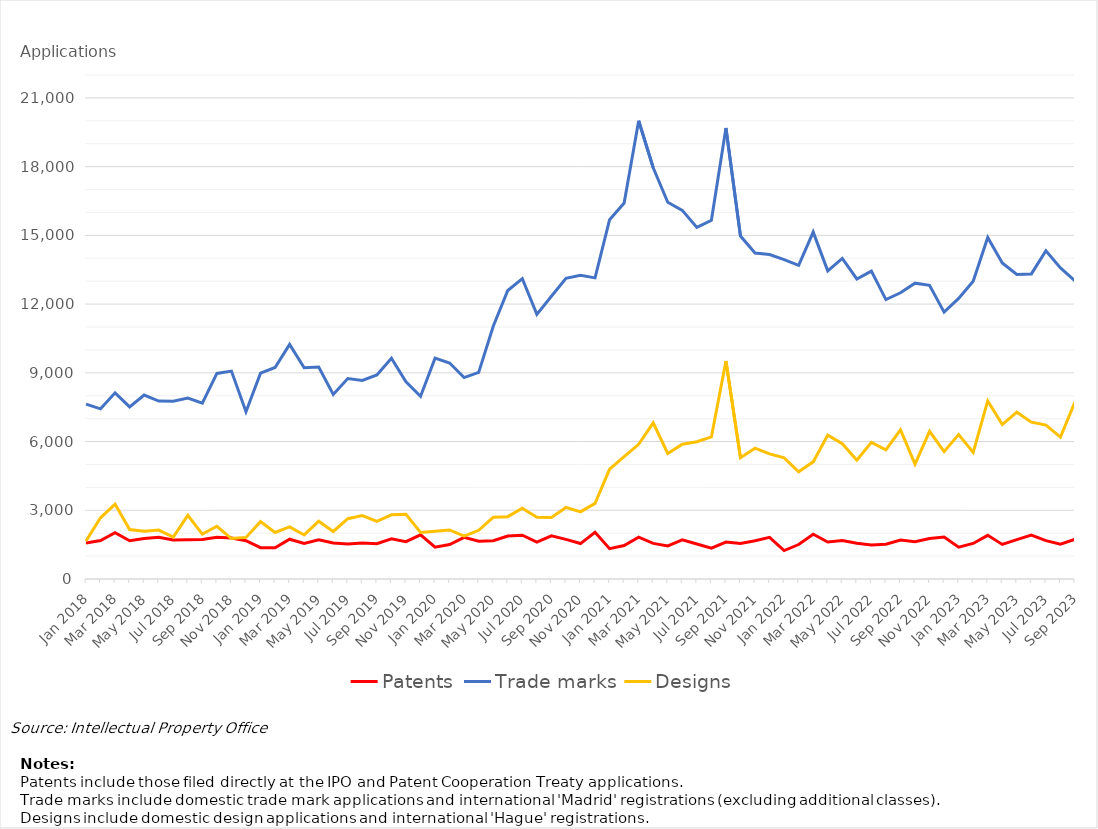
| Category | Patents | Trade marks | Designs |
|---|---|---|---|
| Jan 2018 | 1575 | 7634 | 1658 |
| Feb 2018 | 1676 | 7428 | 2672 |
| Mar 2018 | 2022 | 8127 | 3267 |
| Apr 2018 | 1670 | 7512 | 2160 |
| May 2018 | 1767 | 8030 | 2083 |
| Jun 2018 | 1821 | 7769 | 2136 |
| Jul 2018 | 1704 | 7757 | 1832 |
| Aug 2018 | 1713 | 7897 | 2777 |
| Sep 2018 | 1725 | 7673 | 1960 |
| Oct 2018 | 1818 | 8972 | 2302 |
| Nov 2018 | 1787 | 9076 | 1765 |
| Dec 2018 | 1670 | 7304 | 1815 |
| Jan 2019 | 1367 | 8985 | 2505 |
| Feb 2019 | 1361 | 9234 | 2031 |
| Mar 2019 | 1737 | 10243 | 2274 |
| Apr 2019 | 1552 | 9219 | 1923 |
| May 2019 | 1710 | 9251 | 2520 |
| Jun 2019 | 1569 | 8053 | 2074 |
| Jul 2019 | 1527 | 8752 | 2634 |
| Aug 2019 | 1571 | 8670 | 2768 |
| Sep 2019 | 1540 | 8908 | 2511 |
| Oct 2019 | 1755 | 9636 | 2800 |
| Nov 2019 | 1630 | 8607 | 2827 |
| Dec 2019 | 1926 | 7970 | 2028 |
| Jan 2020 | 1391 | 9642 | 2082 |
| Feb 2020 | 1504 | 9428 | 2143 |
| Mar 2020 | 1819 | 8794 | 1872 |
| Apr 2020 | 1648 | 9021 | 2127 |
| May 2020 | 1672 | 11035 | 2695 |
| Jun 2020 | 1879 | 12593 | 2721 |
| Jul 2020 | 1912 | 13110 | 3086 |
| Aug 2020 | 1613 | 11551 | 2695 |
| Sep 2020 | 1886 | 12340 | 2686 |
| Oct 2020 | 1730 | 13126 | 3124 |
| Nov 2020 | 1547 | 13254 | 2930 |
| Dec 2020 | 2042 | 13144 | 3302 |
| Jan 2021 | 1324 | 15685 | 4792 |
| Feb 2021 | 1462 | 16413 | 5340 |
| Mar 2021 | 1828 | 20001 | 5878 |
| Apr 2021 | 1554 | 17951 | 6815 |
| May 2021 | 1446 | 16446 | 5480 |
| Jun 2021 | 1712 | 16090 | 5881 |
| Jul 2021 | 1528 | 15346 | 5989 |
| Aug 2021 | 1344 | 15659 | 6200 |
| Sep 2021 | 1615 | 19685 | 9517 |
| Oct 2021 | 1547 | 14968 | 5292 |
| Nov 2021 | 1670 | 14232 | 5712 |
| Dec 2021 | 1817 | 14162 | 5464 |
| Jan 2022 | 1240 | 13945 | 5288 |
| Feb 2022 | 1505 | 13690 | 4683 |
| Mar 2022 | 1952 | 15142 | 5114 |
| Apr 2022 | 1616 | 13450 | 6282 |
| May 2022 | 1683 | 13992 | 5907 |
| Jun 2022 | 1561 | 13096 | 5183 |
| Jul 2022 | 1483 | 13439 | 5963 |
| Aug 2022 | 1520 | 12197 | 5639 |
| Sep 2022 | 1702 | 12493 | 6515 |
| Oct 2022 | 1630 | 12914 | 5012 |
| Nov 2022 | 1770 | 12819 | 6446 |
| Dec 2022 | 1828 | 11650 | 5558 |
| Jan 2023 | 1390 | 12250 | 6307 |
| Feb 2023 | 1551 | 13001 | 5528 |
| Mar 2023 | 1906 | 14909 | 7776 |
| Apr 2023 | 1507 | 13792 | 6740 |
| May 2023 | 1717 | 13292 | 7281 |
| Jun 2023 | 1921 | 13317 | 6847 |
| Jul 2023 | 1675 | 14327 | 6719 |
| Aug 2023 | 1518 | 13579 | 6193 |
| Sep 2023 | 1734 | 13012 | 7735 |